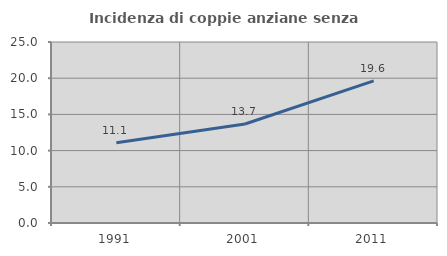
| Category | Incidenza di coppie anziane senza figli  |
|---|---|
| 1991.0 | 11.071 |
| 2001.0 | 13.678 |
| 2011.0 | 19.63 |